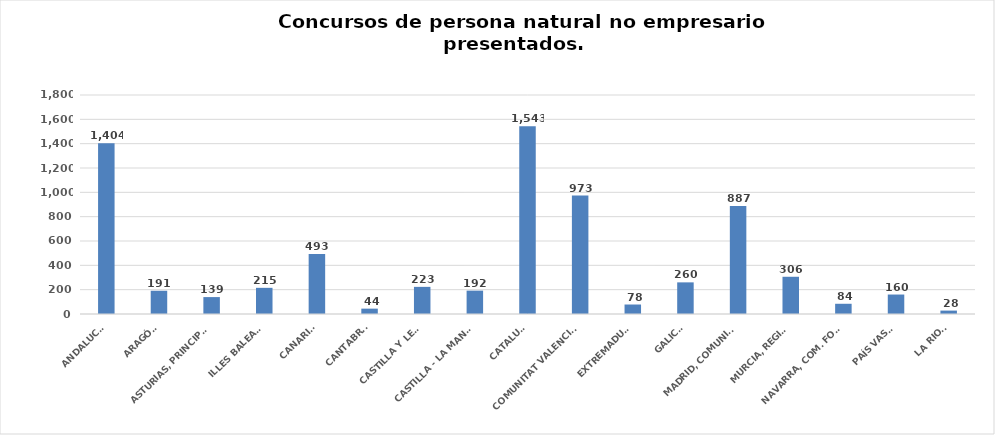
| Category | Series 0 |
|---|---|
| ANDALUCÍA | 1404 |
| ARAGÓN | 191 |
| ASTURIAS, PRINCIPADO | 139 |
| ILLES BALEARS | 215 |
| CANARIAS | 493 |
| CANTABRIA | 44 |
| CASTILLA Y LEÓN | 223 |
| CASTILLA - LA MANCHA | 192 |
| CATALUÑA | 1543 |
| COMUNITAT VALENCIANA | 973 |
| EXTREMADURA | 78 |
| GALICIA | 260 |
| MADRID, COMUNIDAD | 887 |
| MURCIA, REGIÓN | 306 |
| NAVARRA, COM. FORAL | 84 |
| PAÍS VASCO | 160 |
| LA RIOJA | 28 |